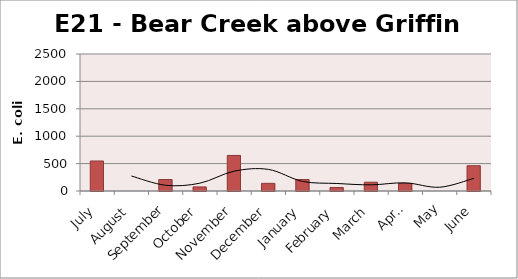
| Category | E. coli MPN |
|---|---|
| July | 547.5 |
| August | 0 |
| September | 209.8 |
| October | 74.9 |
| November | 648.8 |
| December | 139.6 |
| January | 209.8 |
| February | 64.4 |
| March | 160.7 |
| April | 137.6 |
| May | 0 |
| June | 461.1 |